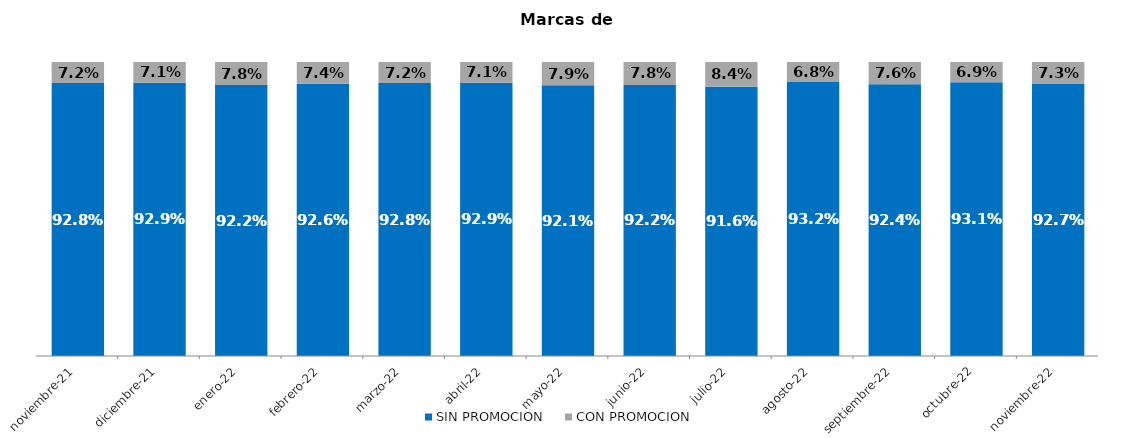
| Category | SIN PROMOCION   | CON PROMOCION   |
|---|---|---|
| 2021-11-01 | 0.928 | 0.072 |
| 2021-12-01 | 0.929 | 0.071 |
| 2022-01-01 | 0.922 | 0.078 |
| 2022-02-01 | 0.926 | 0.074 |
| 2022-03-01 | 0.928 | 0.072 |
| 2022-04-01 | 0.929 | 0.071 |
| 2022-05-01 | 0.921 | 0.079 |
| 2022-06-01 | 0.922 | 0.078 |
| 2022-07-01 | 0.916 | 0.084 |
| 2022-08-01 | 0.932 | 0.068 |
| 2022-09-01 | 0.924 | 0.076 |
| 2022-10-01 | 0.931 | 0.069 |
| 2022-11-01 | 0.927 | 0.073 |